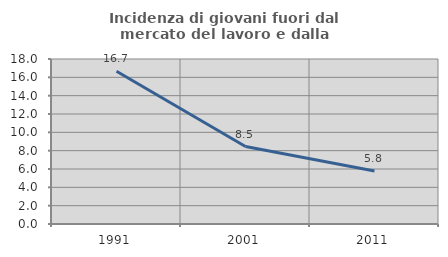
| Category | Incidenza di giovani fuori dal mercato del lavoro e dalla formazione  |
|---|---|
| 1991.0 | 16.667 |
| 2001.0 | 8.451 |
| 2011.0 | 5.78 |